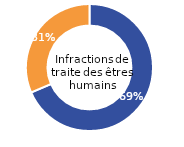
| Category | Infractions de traite des êtres humains |
|---|---|
| Femme (%) | 68.56 |
| Homme (%) | 31.44 |